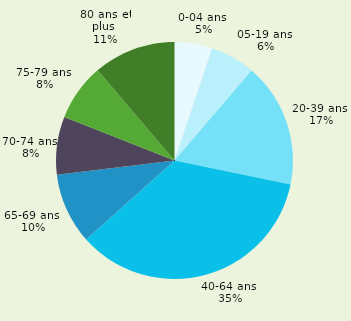
| Category | Series 0 |
|---|---|
| 0-04 ans  | 0.052 |
| 05-19 ans  | 0.061 |
| 20-39 ans  | 0.17 |
| 40-64 ans  | 0.352 |
| 65-69 ans  | 0.097 |
| 70-74 ans  | 0.079 |
| 75-79 ans  | 0.078 |
| 80 ans et plus  | 0.112 |